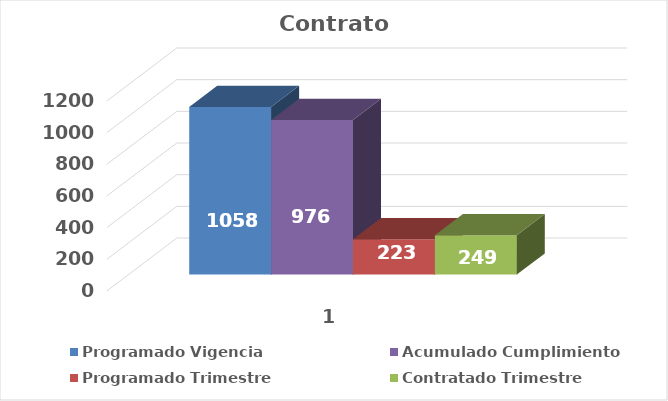
| Category | Programado Vigencia | Acumulado Cumplimiento | Programado Trimestre | Contratado Trimestre |
|---|---|---|---|---|
| 0 | 1058 | 976 | 223 | 249 |